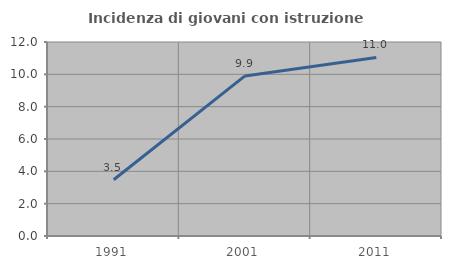
| Category | Incidenza di giovani con istruzione universitaria |
|---|---|
| 1991.0 | 3.483 |
| 2001.0 | 9.901 |
| 2011.0 | 11.043 |